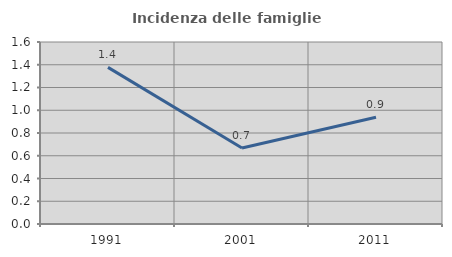
| Category | Incidenza delle famiglie numerose |
|---|---|
| 1991.0 | 1.377 |
| 2001.0 | 0.667 |
| 2011.0 | 0.939 |